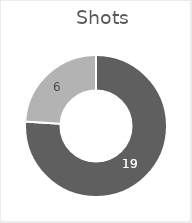
| Category | Shots |
|---|---|
| Liverpool | 19 |
| Manchester United | 6 |